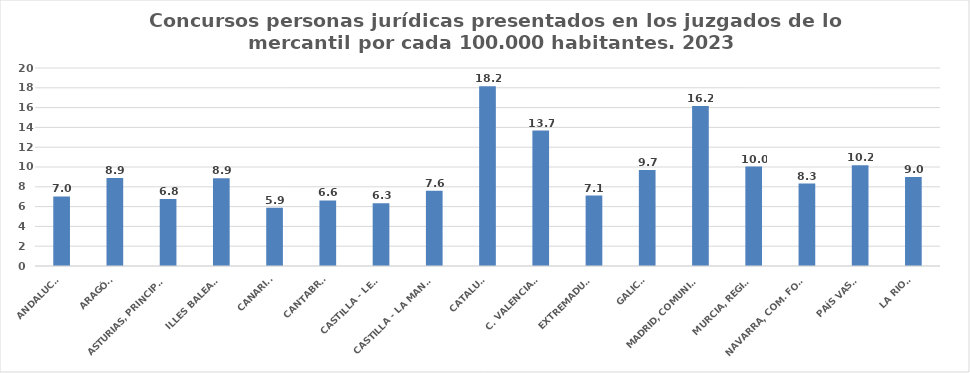
| Category | Series 0 |
|---|---|
| ANDALUCÍA | 7.021 |
| ARAGÓN | 8.893 |
| ASTURIAS, PRINCIPADO | 6.755 |
| ILLES BALEARS | 8.867 |
| CANARIAS | 5.875 |
| CANTABRIA | 6.627 |
| CASTILLA - LEÓN | 6.338 |
| CASTILLA - LA MANCHA | 7.594 |
| CATALUÑA | 18.167 |
| C. VALENCIANA | 13.683 |
| EXTREMADURA | 7.114 |
| GALICIA | 9.705 |
| MADRID, COMUNIDAD | 16.163 |
| MURCIA, REGIÓN | 10.047 |
| NAVARRA, COM. FORAL | 8.331 |
| PAÍS VASCO | 10.181 |
| LA RIOJA | 8.999 |